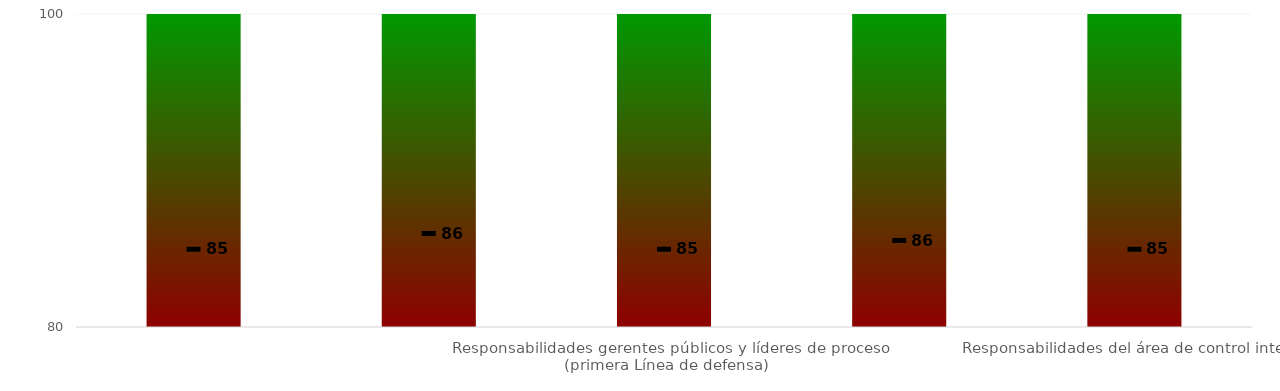
| Category | Niveles |
|---|---|
|   | 100 |
| Responsabilidades de la Alta dirección y Comité Institucional de Coordinación de Control Interno (línea estratégica) | 100 |
| Responsabilidades gerentes públicos y líderes de proceso (primera Línea de defensa) | 100 |
| Responsabilidades de los servidores encargados del monitoreo y evaluación de controles y gestión del riesgo (segunda línea de defensa) | 100 |
| Responsabilidades del área de control interno | 100 |